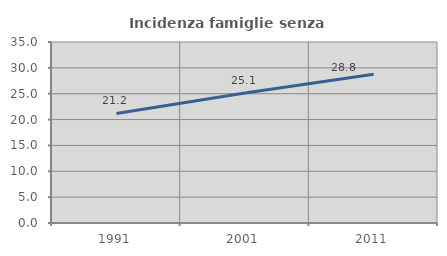
| Category | Incidenza famiglie senza nuclei |
|---|---|
| 1991.0 | 21.182 |
| 2001.0 | 25.126 |
| 2011.0 | 28.761 |